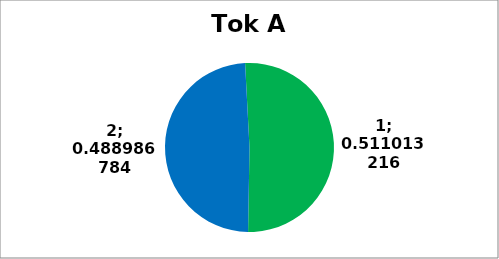
| Category | Series 0 |
|---|---|
| 0 | 116 |
| 1 | 111 |